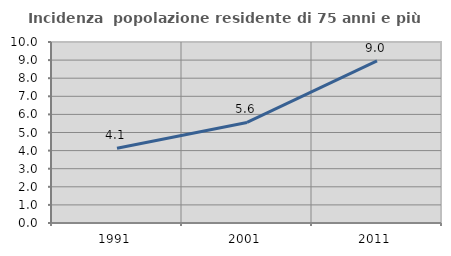
| Category | Incidenza  popolazione residente di 75 anni e più |
|---|---|
| 1991.0 | 4.128 |
| 2001.0 | 5.556 |
| 2011.0 | 8.96 |